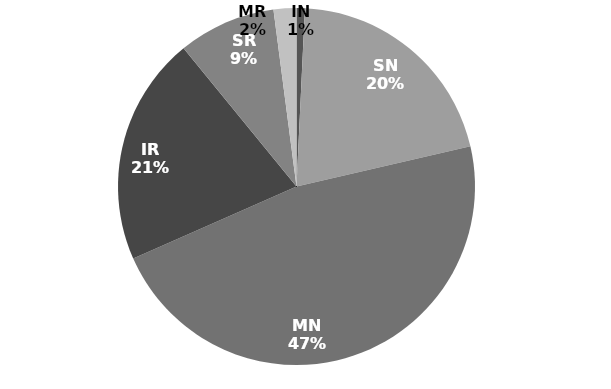
| Category | Series 0 |
|---|---|
| IN | 588093120000000 |
| SN | 16112195763108612 |
| MN | 36714468660302824 |
| IR | 16181770314382266 |
| SR | 6905226755617978 |
| MR | 1612220539828834.8 |